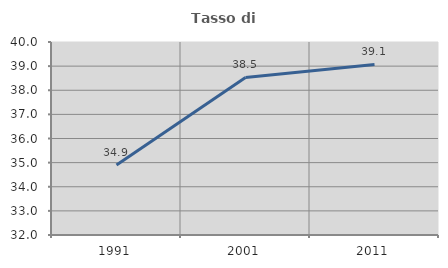
| Category | Tasso di occupazione   |
|---|---|
| 1991.0 | 34.904 |
| 2001.0 | 38.532 |
| 2011.0 | 39.071 |